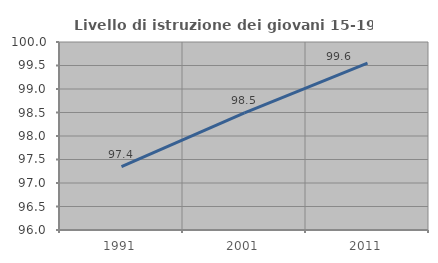
| Category | Livello di istruzione dei giovani 15-19 anni |
|---|---|
| 1991.0 | 97.35 |
| 2001.0 | 98.491 |
| 2011.0 | 99.552 |